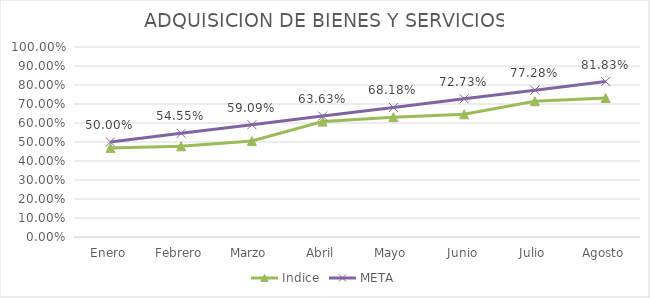
| Category | Indice | META |
|---|---|---|
| Enero | 0.469 | 0.5 |
| Febrero | 0.477 | 0.546 |
| Marzo | 0.505 | 0.591 |
| Abril | 0.607 | 0.636 |
| Mayo | 0.631 | 0.682 |
| Junio | 0.646 | 0.727 |
| Julio | 0.715 | 0.773 |
| Agosto | 0.732 | 0.818 |